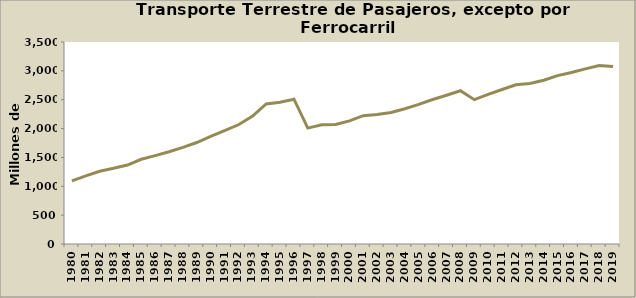
| Category | Series 0 |
|---|---|
| 1980.0 | 1094 |
| 1981.0 | 1180 |
| 1982.0 | 1261 |
| 1983.0 | 1312 |
| 1984.0 | 1368 |
| 1985.0 | 1468 |
| 1986.0 | 1531 |
| 1987.0 | 1599 |
| 1988.0 | 1673 |
| 1989.0 | 1758 |
| 1990.0 | 1865 |
| 1991.0 | 1965 |
| 1992.0 | 2066 |
| 1993.0 | 2212 |
| 1994.0 | 2426 |
| 1995.0 | 2457 |
| 1996.0 | 2509 |
| 1997.0 | 2008 |
| 1998.0 | 2065 |
| 1999.0 | 2070 |
| 2000.0 | 2134 |
| 2001.0 | 2224 |
| 2002.0 | 2245 |
| 2003.0 | 2279 |
| 2004.0 | 2344 |
| 2005.0 | 2418 |
| 2006.0 | 2503 |
| 2007.0 | 2578 |
| 2008.0 | 2655 |
| 2009.0 | 2501 |
| 2010.0 | 2591 |
| 2011.0 | 2677 |
| 2012.0 | 2758 |
| 2013.0 | 2781 |
| 2014.0 | 2836.795 |
| 2015.0 | 2918 |
| 2016.0 | 2970.86 |
| 2017.0 | 3034.82 |
| 2018.0 | 3093.86 |
| 2019.0 | 3074.18 |